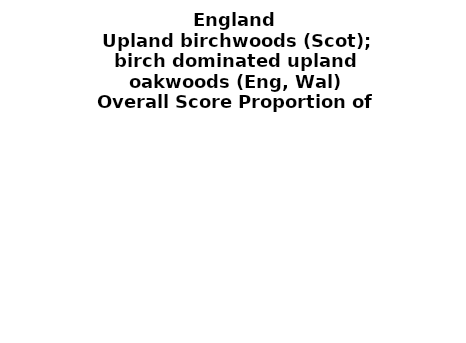
| Category | Upland birchwoods (Scot); birch dominated upland oakwoods (Eng, Wal) |
|---|---|
| 21 or less | 0 |
| 22 or 23 | 0 |
| 24 or 25 | 0 |
| 26 or 27 | 0.003 |
| 28 or 29 | 0.113 |
| 30 or 31 | 0.209 |
| 32 or 33 | 0.458 |
| 34 or 35 | 0.199 |
| 36 or 37 | 0.018 |
| 38 or 39 | 0 |
| 40 or 41 | 0 |
| 42 or 43 | 0 |
| 44 or more | 0 |